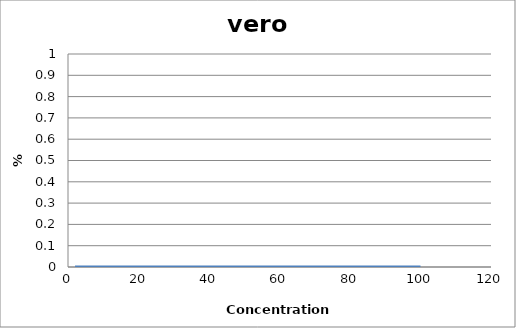
| Category | vero chu2 |
|---|---|
| 100.0 | 0 |
| 50.0 | 0 |
| 20.0 | 0 |
| 2.0 | 0 |
| nan | 0 |
| nan | 0 |
| nan | 0 |
| nan | 0 |
| nan | 0 |